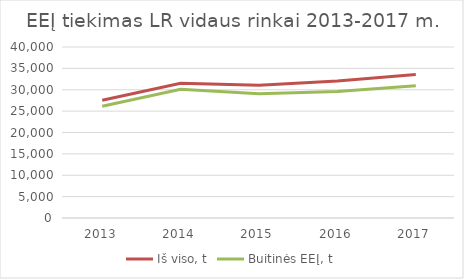
| Category | Iš viso, t | Buitinės EEĮ, t |
|---|---|---|
| 2013.0 | 27541.651 | 26140.53 |
| 2014.0 | 31503.752 | 30115.63 |
| 2015.0 | 31066.57 | 29044.012 |
| 2016.0 | 32064.065 | 29586.305 |
| 2017.0 | 33582.408 | 30942.73 |